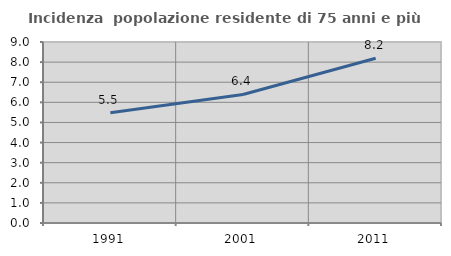
| Category | Incidenza  popolazione residente di 75 anni e più |
|---|---|
| 1991.0 | 5.48 |
| 2001.0 | 6.39 |
| 2011.0 | 8.189 |